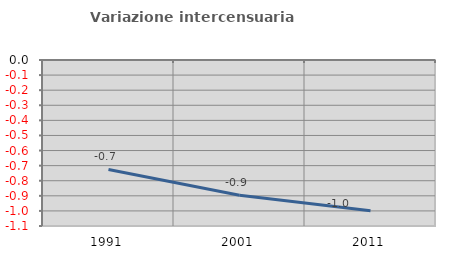
| Category | Variazione intercensuaria annua |
|---|---|
| 1991.0 | -0.725 |
| 2001.0 | -0.896 |
| 2011.0 | -0.998 |